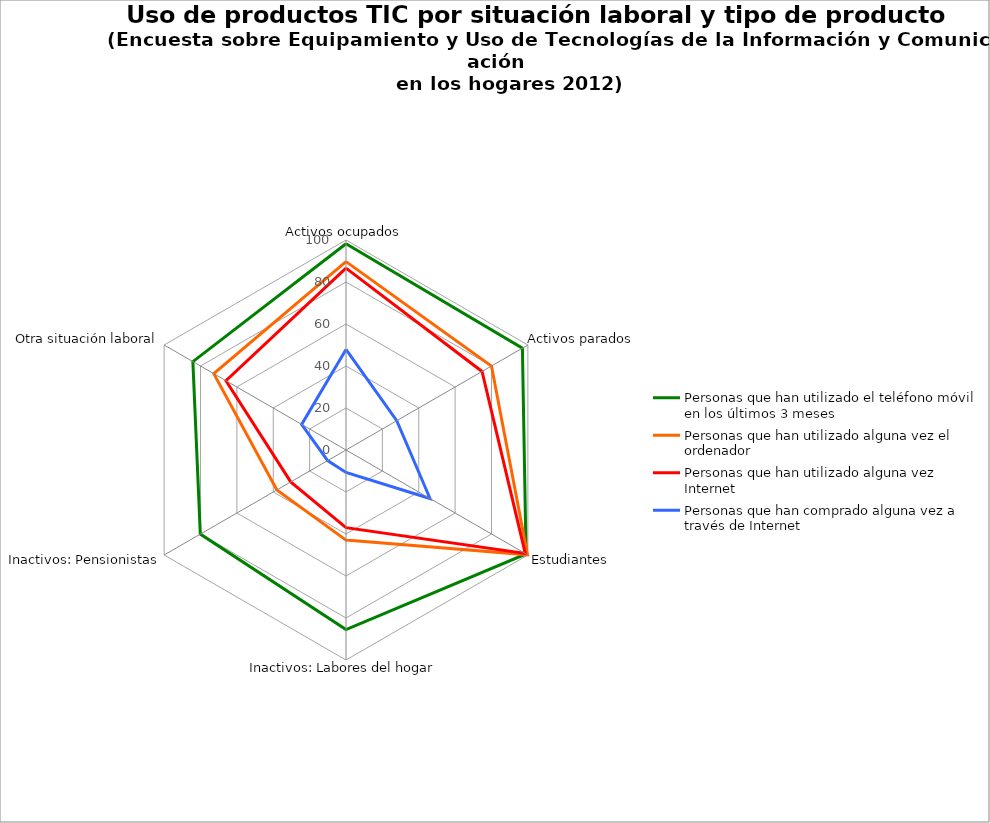
| Category | Personas que han utilizado el teléfono móvil en los últimos 3 meses | Personas que han utilizado alguna vez el ordenador | Personas que han utilizado alguna vez Internet | Personas que han comprado alguna vez a través de Internet |
|---|---|---|---|---|
| Activos ocupados | 98.2 | 89.7 | 86.6 | 47.9 |
| Activos parados | 97 | 80 | 74.8 | 27.9 |
|  Estudiantes | 99 | 99.8 | 98.6 | 46.2 |
| Inactivos: Labores del hogar | 85.5 | 42.9 | 37 | 10.7 |
|  Inactivos: Pensionistas | 80.1 | 38 | 30.4 | 10.1 |
|  Otra situación laboral | 84.2 | 72.7 | 66 | 24.4 |